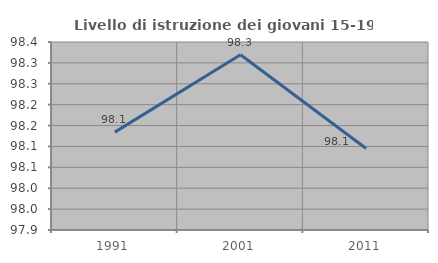
| Category | Livello di istruzione dei giovani 15-19 anni |
|---|---|
| 1991.0 | 98.134 |
| 2001.0 | 98.319 |
| 2011.0 | 98.095 |